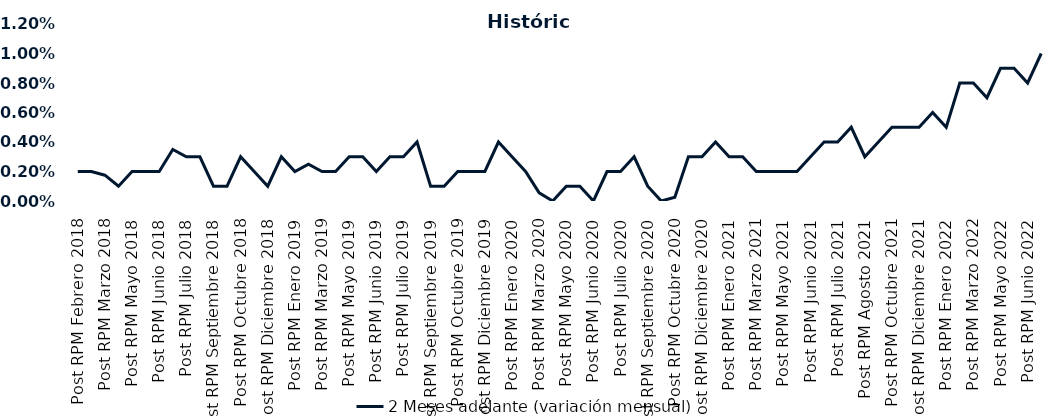
| Category | 2 Meses adelante (variación mensual) |
|---|---|
| Post RPM Febrero 2018 | 0.002 |
| Pre RPM Marzo 2018 | 0.002 |
| Post RPM Marzo 2018 | 0.002 |
| Pre RPM Mayo 2018 | 0.001 |
| Post RPM Mayo 2018 | 0.002 |
| Pre RPM Junio 2018 | 0.002 |
| Post RPM Junio 2018 | 0.002 |
| Pre RPM Julio 2018 | 0.004 |
| Post RPM Julio 2018 | 0.003 |
| Pre RPM Septiembre 2018 | 0.003 |
| Post RPM Septiembre 2018 | 0.001 |
| Pre RPM Octubre 2018 | 0.001 |
| Post RPM Octubre 2018 | 0.003 |
| Pre RPM Diciembre 2018 | 0.002 |
| Post RPM Diciembre 2018 | 0.001 |
| Pre RPM Enero 2019 | 0.003 |
| Post RPM Enero 2019 | 0.002 |
| Pre RPM Marzo 2019 | 0.002 |
| Post RPM Marzo 2019 | 0.002 |
| Pre RPM Mayo 2019 | 0.002 |
| Post RPM Mayo 2019 | 0.003 |
| Pre RPM Junio 2019 | 0.003 |
| Post RPM Junio 2019 | 0.002 |
| Pre RPM Julio 2019 | 0.003 |
| Post RPM Julio 2019 | 0.003 |
| Pre RPM Septiembre 2019 | 0.004 |
| Post RPM Septiembre 2019 | 0.001 |
| Pre RPM Octubre 2019 | 0.001 |
| Post RPM Octubre 2019 | 0.002 |
| Pre RPM Diciembre 2019 | 0.002 |
| Post RPM Diciembre 2019 | 0.002 |
| Pre RPM Enero 2020 | 0.004 |
| Post RPM Enero 2020 | 0.003 |
| Pre RPM Marzo 2020 | 0.002 |
| Post RPM Marzo 2020 | 0.001 |
| Pre RPM Mayo 2020 | 0 |
| Post RPM Mayo 2020 | 0.001 |
| Pre RPM Junio 2020 | 0.001 |
| Post RPM Junio 2020 | 0 |
| Pre RPM Julio 2020 | 0.002 |
| Post RPM Julio 2020 | 0.002 |
| Pre RPM Septiembre 2020 | 0.003 |
| Post RPM Septiembre 2020 | 0.001 |
| Pre RPM Octubre 2020 | 0 |
| Post RPM Octubre 2020 | 0 |
| Pre RPM Diciembre 2020 | 0.003 |
| Post RPM Diciembre 2020 | 0.003 |
| Pre RPM Enero 2021 | 0.004 |
| Post RPM Enero 2021 | 0.003 |
| Pre RPM Marzo 2021 | 0.003 |
| Post RPM Marzo 2021 | 0.002 |
| Pre RPM Mayo 2021 | 0.002 |
| Post RPM Mayo 2021 | 0.002 |
| Pre RPM Junio 2021 | 0.002 |
| Post RPM Junio 2021 | 0.003 |
| Pre RPM Julio 2021 | 0.004 |
| Post RPM Julio 2021 | 0.004 |
| Pre RPM Agosto 2021 | 0.005 |
| Post RPM Agosto 2021 | 0.003 |
| Pre RPM Octubre 2021 | 0.004 |
| Post RPM Octubre 2021 | 0.005 |
| Pre RPM Diciembre 2021 | 0.005 |
| Post RPM Diciembre 2021 | 0.005 |
| Pre RPM Enero 2022 | 0.006 |
| Post RPM Enero 2022 | 0.005 |
| Pre RPM Marzo 2022 | 0.008 |
| Post RPM Marzo 2022 | 0.008 |
| Pre RPM Mayo 2022 | 0.007 |
| Post RPM Mayo 2022 | 0.009 |
| Pre RPM Junio 2022 | 0.009 |
| Post RPM Junio 2022 | 0.008 |
| Pre RPM Julio 2022 | 0.01 |